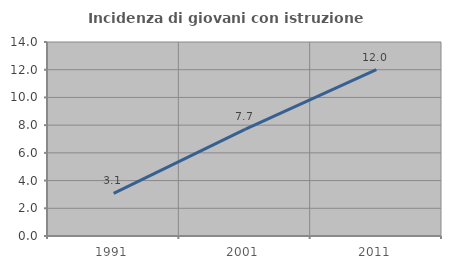
| Category | Incidenza di giovani con istruzione universitaria |
|---|---|
| 1991.0 | 3.077 |
| 2001.0 | 7.692 |
| 2011.0 | 12 |